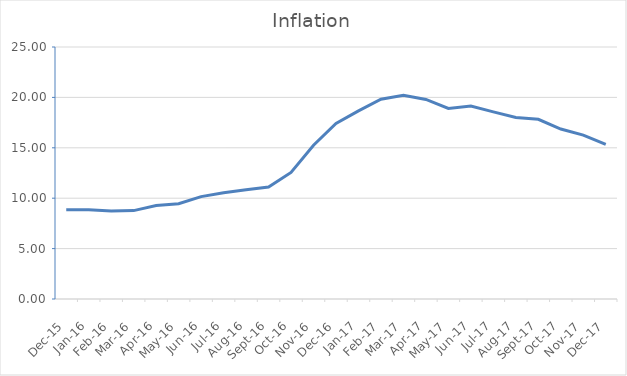
| Category | Inflation |
|---|---|
| 2015-12-01 | 8.85 |
| 2016-01-01 | 8.86 |
| 2016-02-01 | 8.73 |
| 2016-03-01 | 8.77 |
| 2016-04-01 | 9.28 |
| 2016-05-01 | 9.45 |
| 2016-06-01 | 10.16 |
| 2016-07-01 | 10.53 |
| 2016-08-01 | 10.84 |
| 2016-09-01 | 11.11 |
| 2016-10-01 | 12.56 |
| 2016-11-01 | 15.26 |
| 2016-12-01 | 17.41 |
| 2017-01-01 | 18.661 |
| 2017-02-01 | 19.817 |
| 2017-03-01 | 20.22 |
| 2017-04-01 | 19.8 |
| 2017-05-01 | 18.91 |
| 2017-06-01 | 19.14 |
| 2017-07-01 | 18.56 |
| 2017-08-01 | 18.01 |
| 2017-09-01 | 17.83 |
| 2017-10-01 | 16.86 |
| 2017-11-01 | 16.26 |
| 2017-12-01 | 15.33 |